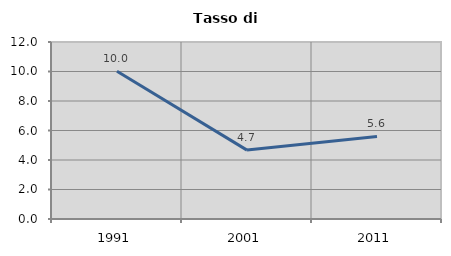
| Category | Tasso di disoccupazione   |
|---|---|
| 1991.0 | 10.011 |
| 2001.0 | 4.671 |
| 2011.0 | 5.6 |